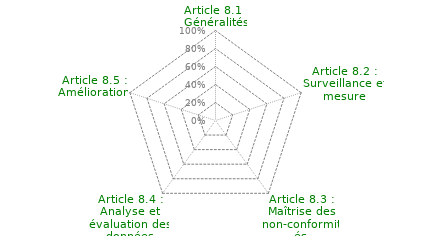
| Category | Article 8 : Mesure, analyse et amélioration |
|---|---|
| Article 8.1 : Généralités | 0 |
| Article 8.2 : Surveillance et mesure | 0 |
| Article 8.3 : Maîtrise des non-conformités | 0 |
| Article 8.4 : Analyse et évaluation des données | 0 |
| Article 8.5 : Amélioration | 0 |